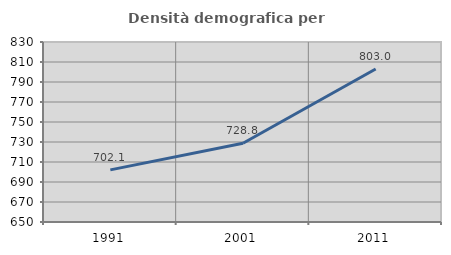
| Category | Densità demografica |
|---|---|
| 1991.0 | 702.128 |
| 2001.0 | 728.782 |
| 2011.0 | 803.031 |